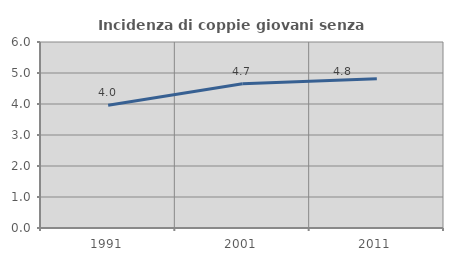
| Category | Incidenza di coppie giovani senza figli |
|---|---|
| 1991.0 | 3.96 |
| 2001.0 | 4.651 |
| 2011.0 | 4.813 |